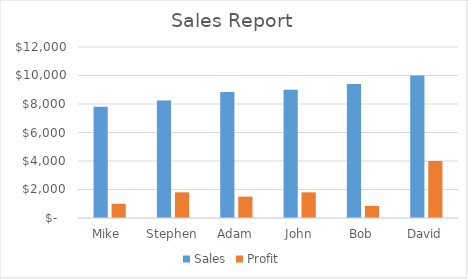
| Category | Sales | Profit |
|---|---|---|
| Mike  | 7800 | 1000 |
| Stephen | 8250 | 1800 |
| Adam | 8850 | 1500 |
| John | 9000 | 1800 |
| Bob | 9400 | 850 |
| David | 10000 | 4000 |